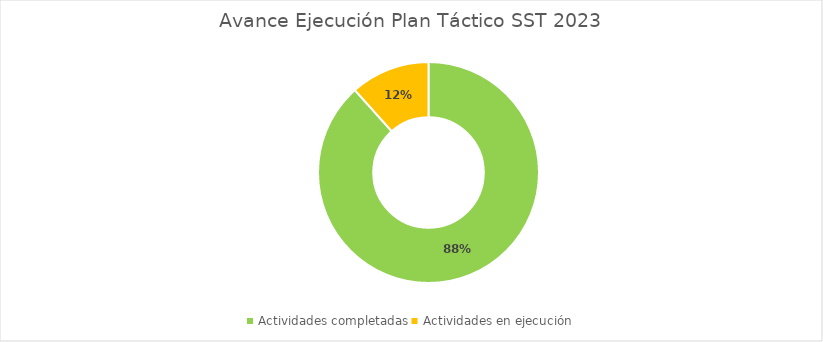
| Category | Actividades completadas |
|---|---|
| Actividades completadas | 0.884 |
| Actividades en ejecución | 0.116 |